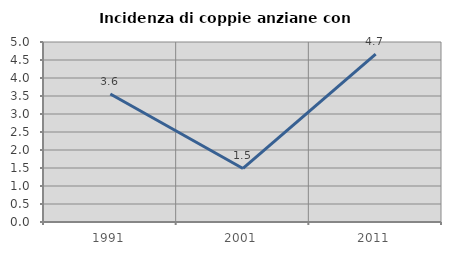
| Category | Incidenza di coppie anziane con figli |
|---|---|
| 1991.0 | 3.557 |
| 2001.0 | 1.487 |
| 2011.0 | 4.661 |